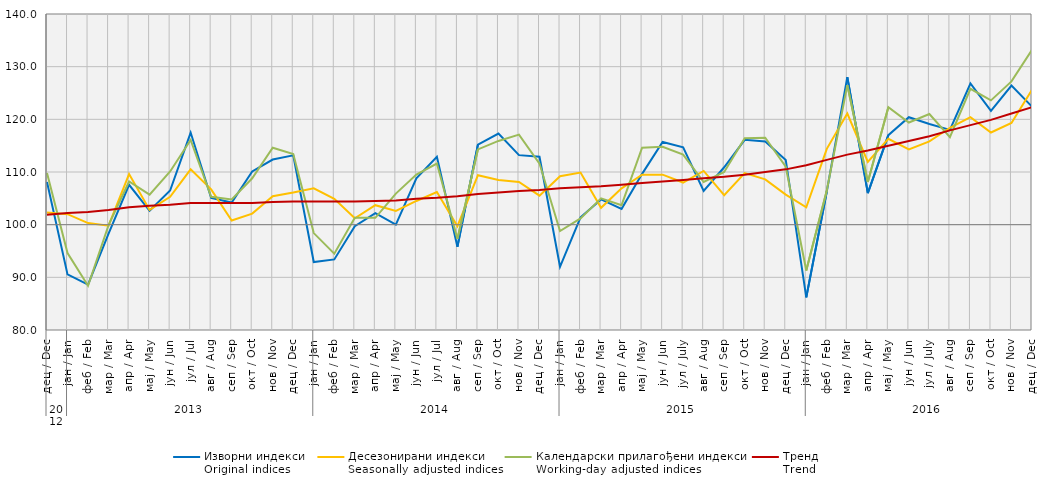
| Category | Изворни индекси
Original indices | Десезонирани индекси
Seasonally adjusted indices | Календарски прилагођени индекси
Working-day adjusted indices | Тренд
Trend |
|---|---|---|---|---|
| 0 | 108.112 | 102.3 | 109.8 | 101.9 |
| 1 | 90.559 | 102 | 94.6 | 102.2 |
| 2 | 88.596 | 100.3 | 88.4 | 102.4 |
| 3 | 98.288 | 99.8 | 99.9 | 102.8 |
| 4 | 107.567 | 109.6 | 108.2 | 103.3 |
| 5 | 102.635 | 102.8 | 105.7 | 103.6 |
| 6 | 106.478 | 105.3 | 110.1 | 103.8 |
| 7 | 117.488 | 110.5 | 116.1 | 104.1 |
| 8 | 105.073 | 106.7 | 105.3 | 104.1 |
| 9 | 104.198 | 100.8 | 104.8 | 104.1 |
| 10 | 110.096 | 102.1 | 108.8 | 104.1 |
| 11 | 112.368 | 105.4 | 114.6 | 104.3 |
| 12 | 113.169 | 106.1 | 113.4 | 104.4 |
| 13 | 92.9 | 106.9 | 98.4 | 104.4 |
| 14 | 93.4 | 104.9 | 94.5 | 104.4 |
| 15 | 99.7 | 101.2 | 101.3 | 104.4 |
| 16 | 102.2 | 103.7 | 101.3 | 104.5 |
| 17 | 100 | 102.6 | 105.9 | 104.6 |
| 18 | 108.8 | 104.5 | 109.5 | 104.9 |
| 19 | 112.9 | 106.2 | 111.6 | 105.1 |
| 20 | 95.8 | 99.7 | 97.3 | 105.4 |
| 21 | 115.2 | 109.4 | 114.3 | 105.8 |
| 22 | 117.3 | 108.5 | 115.9 | 106.1 |
| 23 | 113.2 | 108.1 | 117.1 | 106.4 |
| 24 | 112.9 | 105.5 | 111.6 | 106.6 |
| 25 | 92 | 109.2 | 98.8 | 106.9 |
| 26 | 101.4 | 109.9 | 101.2 | 107.1 |
| 27 | 104.8 | 103.2 | 105 | 107.3 |
| 28 | 103 | 106.9 | 103.7 | 107.6 |
| 29 | 109.651 | 109.5 | 114.6 | 107.9 |
| 30 | 115.698 | 109.5 | 114.8 | 108.2 |
| 31 | 114.7 | 108 | 113.3 | 108.5 |
| 32 | 106.4 | 110.2 | 108.1 | 108.8 |
| 33 | 110.9 | 105.6 | 110 | 109.1 |
| 34 | 116.1 | 109.8 | 116.4 | 109.5 |
| 35 | 115.8 | 108.6 | 116.5 | 110 |
| 36 | 112.3 | 105.7 | 111 | 110.5 |
| 37 | 86.2 | 103.3 | 91.3 | 111.3 |
| 38 | 106.3 | 114.4 | 106.5 | 112.3 |
| 39 | 128 | 121.1 | 126.5 | 113.3 |
| 40 | 106 | 111.9 | 108.1 | 114.1 |
| 41 | 117 | 116.3 | 122.3 | 115 |
| 42 | 120.4 | 114.3 | 119.4 | 115.9 |
| 43 | 119.1 | 115.8 | 121 | 116.8 |
| 44 | 118 | 118.4 | 116.6 | 117.9 |
| 45 | 126.8 | 120.4 | 125.8 | 118.9 |
| 46 | 121.6 | 117.5 | 123.6 | 119.9 |
| 47 | 126.424 | 119.3 | 127.2 | 121.1 |
| 48 | 122.4 | 125.6 | 133.2 | 122.3 |